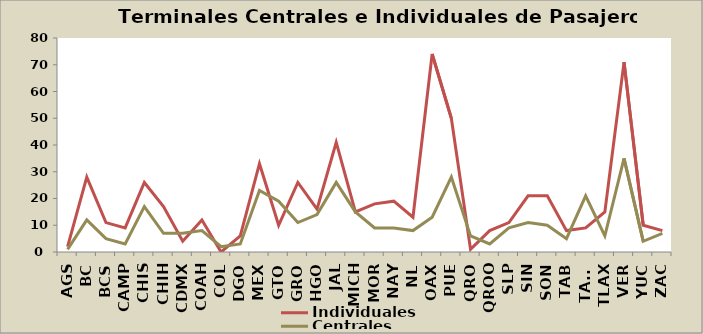
| Category | Individuales | Centrales |
|---|---|---|
| AGS | 2 | 1 |
| BC | 28 | 12 |
| BCS | 11 | 5 |
| CAMP | 9 | 3 |
| CHIS | 26 | 17 |
| CHIH | 17 | 7 |
| CDMX | 4 | 7 |
| COAH | 12 | 8 |
| COL | 0 | 2 |
| DGO | 6 | 3 |
| MEX | 33 | 23 |
| GTO | 10 | 19 |
| GRO | 26 | 11 |
| HGO | 16 | 14 |
| JAL | 41 | 26 |
| MICH | 15 | 15 |
| MOR | 18 | 9 |
| NAY | 19 | 9 |
| NL | 13 | 8 |
| OAX | 74 | 13 |
| PUE | 50 | 28 |
| QRO | 1 | 6 |
| QROO | 8 | 3 |
| SLP | 11 | 9 |
| SIN | 21 | 11 |
| SON | 21 | 10 |
| TAB | 8 | 5 |
| TAMS | 9 | 21 |
| TLAX | 15 | 6 |
| VER | 71 | 35 |
| YUC | 10 | 4 |
| ZAC | 8 | 7 |